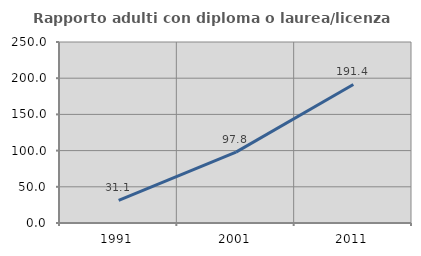
| Category | Rapporto adulti con diploma o laurea/licenza media  |
|---|---|
| 1991.0 | 31.1 |
| 2001.0 | 97.826 |
| 2011.0 | 191.371 |